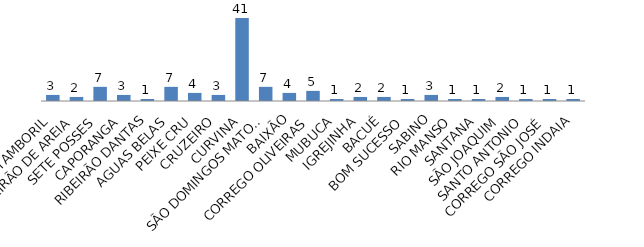
| Category | Series 0 |
|---|---|
| TAMBORIL | 3 |
| RIBEIRÃO DE AREIA | 2 |
| SETE POSSES | 7 |
| CAPORANGA | 3 |
| RIBEIRÃO DANTAS | 1 |
| AGUAS BELAS | 7 |
| PEIXE CRU | 4 |
| CRUZEIRO | 3 |
| CURVINA | 41 |
| SÃO DOMINGOS MATO GRANDE | 7 |
| BAIXÃO | 4 |
| CORREGO OLIVEIRAS | 5 |
| MUBUCA | 1 |
| IGREJINHA | 2 |
| BACUÉ | 2 |
| BOM SUCESSO | 1 |
| SABINO | 3 |
| RIO MANSO | 1 |
| SANTANA | 1 |
| SÃO JOAQUIM | 2 |
| SANTO ANTONIO | 1 |
| CORREGO SÃO JOSÉ | 1 |
| CORREGO INDAIA | 1 |